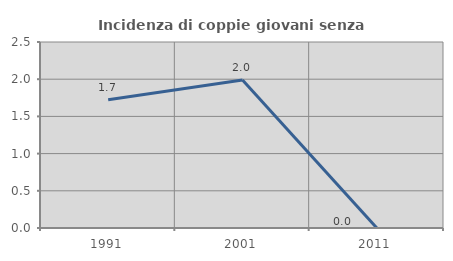
| Category | Incidenza di coppie giovani senza figli |
|---|---|
| 1991.0 | 1.724 |
| 2001.0 | 1.99 |
| 2011.0 | 0 |